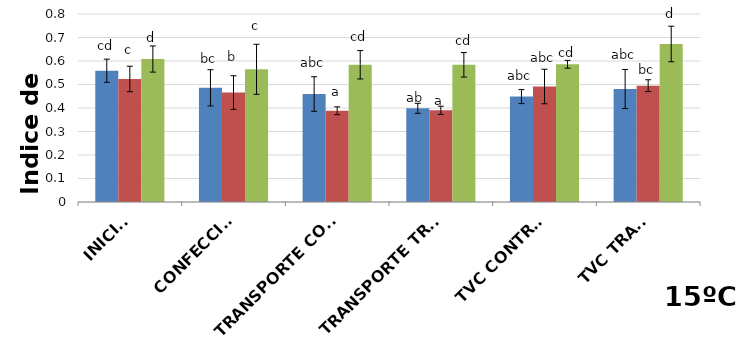
| Category | Black Splendor | Showtime | Black Gold |
|---|---|---|---|
| INICIAL | 0.559 | 0.524 | 0.608 |
| CONFECCIÓN | 0.486 | 0.466 | 0.565 |
| TRANSPORTE CONTROL | 0.46 | 0.388 | 0.584 |
| TRANSPORTE TRAT. | 0.399 | 0.39 | 0.584 |
| TVC CONTROL | 0.449 | 0.491 | 0.586 |
| TVC TRAT. | 0.481 | 0.495 | 0.672 |